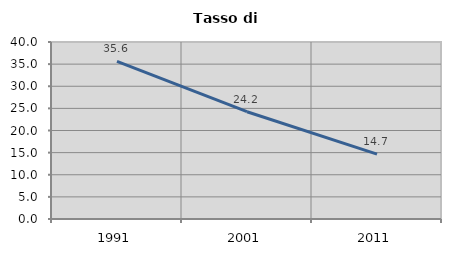
| Category | Tasso di disoccupazione   |
|---|---|
| 1991.0 | 35.609 |
| 2001.0 | 24.244 |
| 2011.0 | 14.676 |